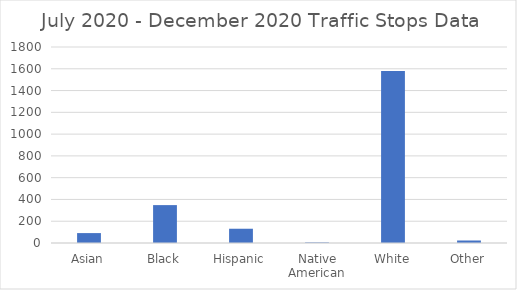
| Category | Series 0 |
|---|---|
| Asian | 91 |
| Black | 348 |
| Hispanic | 131 |
| Native American | 5 |
| White | 1579 |
| Other | 23 |